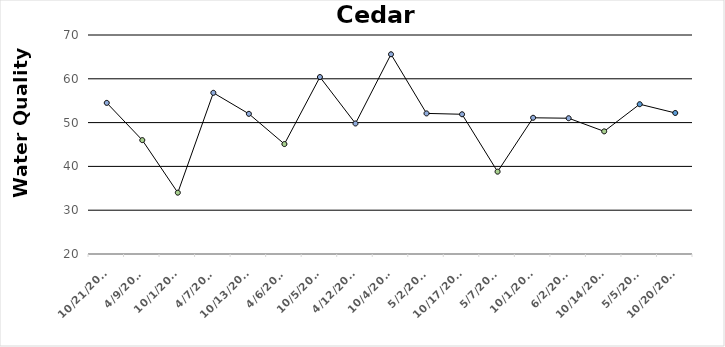
| Category | Series 0 |
|---|---|
| 10/21/10 | 54.5 |
| 4/9/11 | 46 |
| 10/1/11 | 34 |
| 4/7/12 | 56.8 |
| 10/13/12 | 52 |
| 4/6/13 | 45.1 |
| 10/5/13 | 60.4 |
| 4/12/14 | 49.8 |
| 10/4/14 | 65.6 |
| 5/2/15 | 52.1 |
| 10/17/15 | 51.9 |
| 5/7/16 | 38.8 |
| 10/1/16 | 51.1 |
| 6/2/17 | 51 |
| 10/14/17 | 48 |
| 5/5/18 | 54.2 |
| 10/20/18 | 52.2 |